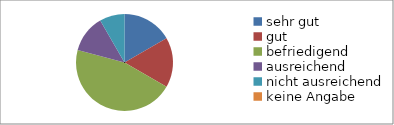
| Category | Series 0 |
|---|---|
| sehr gut | 4 |
| gut | 4 |
| befriedigend | 11 |
| ausreichend | 3 |
| nicht ausreichend | 2 |
| keine Angabe | 0 |